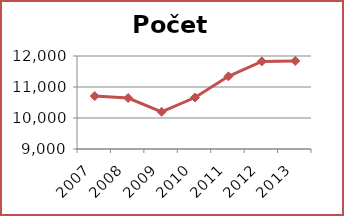
| Category | Počet čtenářů |
|---|---|
| 2007.0 | 10707 |
| 2008.0 | 10644 |
| 2009.0 | 10200 |
| 2010.0 | 10660 |
| 2011.0 | 11344 |
| 2012.0 | 11826 |
| 2013.0 | 11840 |